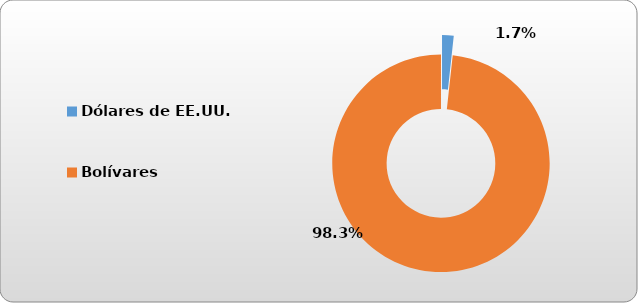
| Category | Dólares de EE.UU. |
|---|---|
| Dólares de EE.UU. | 9361.88 |
| Bolívares | 533881.861 |